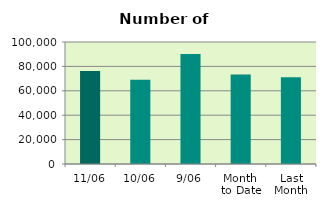
| Category | Series 0 |
|---|---|
| 11/06 | 76330 |
| 10/06 | 69064 |
| 9/06 | 90214 |
| Month 
to Date | 73383.111 |
| Last
Month | 71072.3 |